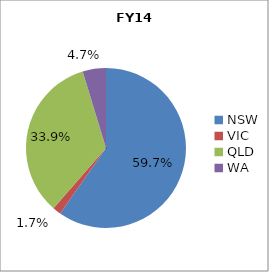
| Category | FY14 |
|---|---|
| NSW | 0.597 |
| VIC | 0.017 |
| QLD | 0.339 |
| WA | 0.047 |